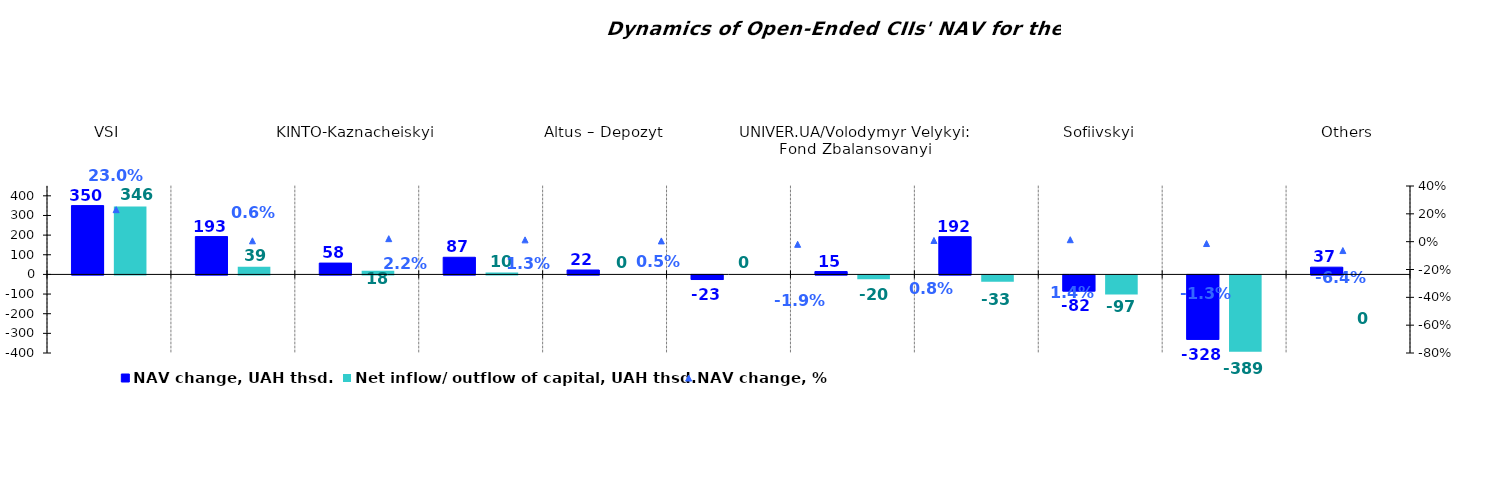
| Category | NAV change, UAH thsd. | Net inflow/ outflow of capital, UAH thsd. |
|---|---|---|
| VSI | 350.271 | 345.516 |
| KINTO- Кlasychnyi | 192.536 | 38.757 |
| KINTO-Kaznacheiskyi | 57.686 | 18.452 |
| UNIVER.UA/Myhailo Hrushevskyi: Fond Derzhavnykh Paperiv    | 87.197 | 9.666 |
| Altus – Depozyt | 22.433 | 0 |
| ТАSК Resurs | -23.464 | 0 |
| UNIVER.UA/Volodymyr Velykyi: Fond Zbalansovanyi | 14.545 | -20.15 |
| ОТP Fond Aktsii | 192.133 | -32.838 |
| Sofiivskyi | -82.315 | -97.053 |
| ОТP - Кlasychnyi | -328.053 | -388.625 |
| Others | 36.832 | 0 |